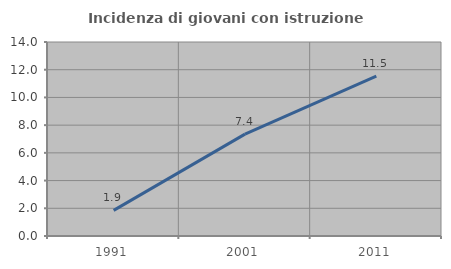
| Category | Incidenza di giovani con istruzione universitaria |
|---|---|
| 1991.0 | 1.852 |
| 2001.0 | 7.353 |
| 2011.0 | 11.538 |